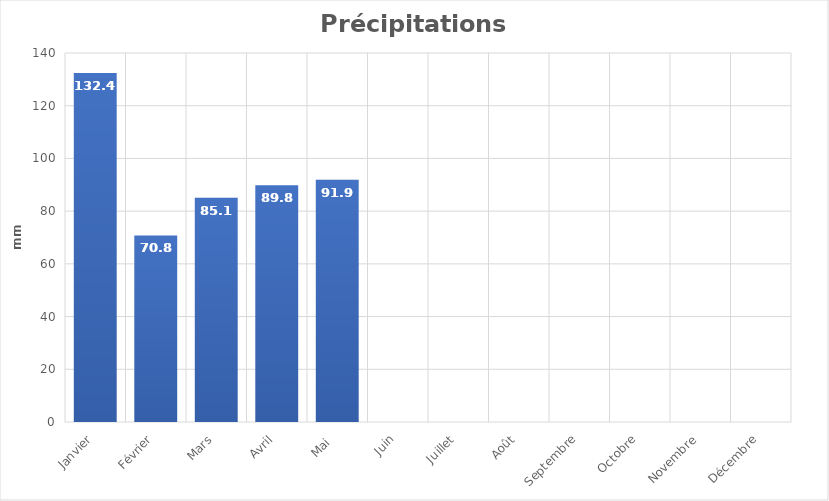
| Category | Series 0 |
|---|---|
| Janvier | 132.4 |
| Février | 70.8 |
| Mars | 85.1 |
| Avril | 89.8 |
| Mai  | 91.9 |
| Juin | 0 |
| Juillet | 0 |
| Août | 0 |
| Septembre | 0 |
| Octobre | 0 |
| Novembre | 0 |
| Décembre | 0 |